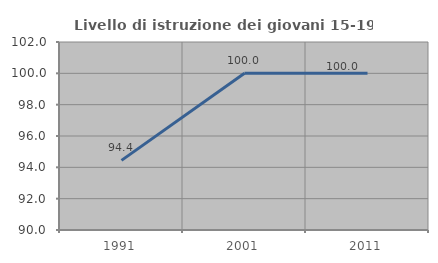
| Category | Livello di istruzione dei giovani 15-19 anni |
|---|---|
| 1991.0 | 94.444 |
| 2001.0 | 100 |
| 2011.0 | 100 |